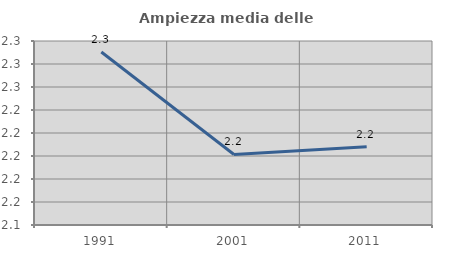
| Category | Ampiezza media delle famiglie |
|---|---|
| 1991.0 | 2.29 |
| 2001.0 | 2.201 |
| 2011.0 | 2.208 |